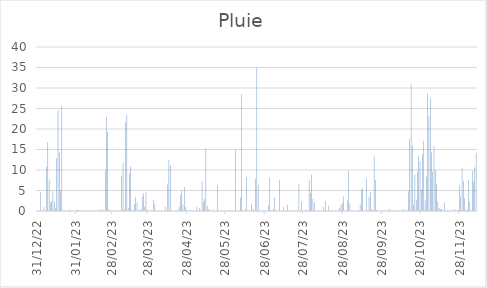
| Category | Pluie |
|---|---|
| 2022-12-31 | 0 |
| 2023-01-01 | 0 |
| 2023-01-02 | 4.57 |
| 2023-01-03 | 0 |
| 2023-01-04 | 0 |
| 2023-01-05 | 1.02 |
| 2023-01-06 | 0 |
| 2023-01-07 | 10.86 |
| 2023-01-08 | 16.76 |
| 2023-01-09 | 7.68 |
| 2023-01-10 | 2.16 |
| 2023-01-11 | 2.41 |
| 2023-01-12 | 4.89 |
| 2023-01-13 | 2.29 |
| 2023-01-14 | 0.64 |
| 2023-01-15 | 12.89 |
| 2023-01-16 | 24.57 |
| 2023-01-17 | 14.29 |
| 2023-01-18 | 5.08 |
| 2023-01-19 | 25.53 |
| 2023-01-20 | 0 |
| 2023-01-21 | 0 |
| 2023-01-22 | 0 |
| 2023-01-23 | 0 |
| 2023-01-24 | 0 |
| 2023-01-25 | 0.38 |
| 2023-01-26 | 0 |
| 2023-01-27 | 0 |
| 2023-01-28 | 0 |
| 2023-01-29 | 0 |
| 2023-01-30 | 0 |
| 2023-01-31 | 0.38 |
| 2023-02-01 | 0.25 |
| 2023-02-02 | 0 |
| 2023-02-03 | 0 |
| 2023-02-04 | 0 |
| 2023-02-05 | 0 |
| 2023-02-06 | 0 |
| 2023-02-07 | 0 |
| 2023-02-08 | 0 |
| 2023-02-09 | 0 |
| 2023-02-10 | 0 |
| 2023-02-11 | 0 |
| 2023-02-12 | 0 |
| 2023-02-13 | 0 |
| 2023-02-14 | 0 |
| 2023-02-15 | 0 |
| 2023-02-16 | 0 |
| 2023-02-17 | 0 |
| 2023-02-18 | 0.38 |
| 2023-02-19 | 0 |
| 2023-02-20 | 0.38 |
| 2023-02-21 | 0 |
| 2023-02-22 | 9.91 |
| 2023-02-23 | 22.99 |
| 2023-02-24 | 19.3 |
| 2023-02-25 | 0.38 |
| 2023-02-26 | 0 |
| 2023-02-27 | 0 |
| 2023-02-28 | 0 |
| 2023-03-01 | 0 |
| 2023-03-02 | 0 |
| 2023-03-03 | 0 |
| 2023-03-04 | 0 |
| 2023-03-05 | 0 |
| 2023-03-06 | 0 |
| 2023-03-07 | 8.64 |
| 2023-03-08 | 11.68 |
| 2023-03-09 | 0.51 |
| 2023-03-10 | 21.72 |
| 2023-03-11 | 23.43 |
| 2023-03-12 | 0.76 |
| 2023-03-13 | 9.21 |
| 2023-03-14 | 10.86 |
| 2023-03-15 | 0.25 |
| 2023-03-16 | 0 |
| 2023-03-17 | 1.71 |
| 2023-03-18 | 3.43 |
| 2023-03-19 | 2.1 |
| 2023-03-20 | 0 |
| 2023-03-21 | 0 |
| 2023-03-22 | 0.51 |
| 2023-03-23 | 3.49 |
| 2023-03-24 | 4.32 |
| 2023-03-25 | 1.02 |
| 2023-03-26 | 4.51 |
| 2023-03-27 | 0.38 |
| 2023-03-28 | 0 |
| 2023-03-29 | 0 |
| 2023-03-30 | 0 |
| 2023-03-31 | 0 |
| 2023-04-01 | 2.73 |
| 2023-04-02 | 1.65 |
| 2023-04-03 | 0 |
| 2023-04-04 | 0 |
| 2023-04-05 | 0 |
| 2023-04-06 | 0 |
| 2023-04-07 | 0 |
| 2023-04-08 | 0 |
| 2023-04-09 | 0 |
| 2023-04-10 | 1.02 |
| 2023-04-11 | 0 |
| 2023-04-12 | 6.48 |
| 2023-04-13 | 12.51 |
| 2023-04-14 | 11.24 |
| 2023-04-15 | 0 |
| 2023-04-16 | 0 |
| 2023-04-17 | 0 |
| 2023-04-18 | 0 |
| 2023-04-19 | 0 |
| 2023-04-20 | 0 |
| 2023-04-21 | 1.02 |
| 2023-04-22 | 3.94 |
| 2023-04-23 | 4.95 |
| 2023-04-24 | 1.52 |
| 2023-04-25 | 5.84 |
| 2023-04-26 | 1.02 |
| 2023-04-27 | 0.25 |
| 2023-04-28 | 0 |
| 2023-04-29 | 0 |
| 2023-04-30 | 0.25 |
| 2023-05-01 | 0 |
| 2023-05-02 | 0 |
| 2023-05-03 | 0 |
| 2023-05-04 | 0 |
| 2023-05-05 | 1.02 |
| 2023-05-06 | 0 |
| 2023-05-07 | 0.76 |
| 2023-05-08 | 0 |
| 2023-05-09 | 7.37 |
| 2023-05-10 | 2.29 |
| 2023-05-11 | 2.92 |
| 2023-05-12 | 15.3 |
| 2023-05-13 | 1.27 |
| 2023-05-14 | 0.51 |
| 2023-05-15 | 0 |
| 2023-05-16 | 0 |
| 2023-05-17 | 0 |
| 2023-05-18 | 0 |
| 2023-05-19 | 0 |
| 2023-05-20 | 0 |
| 2023-05-21 | 6.29 |
| 2023-05-22 | 0 |
| 2023-05-23 | 0 |
| 2023-05-24 | 0 |
| 2023-05-25 | 0 |
| 2023-05-26 | 0 |
| 2023-05-27 | 0 |
| 2023-05-28 | 0 |
| 2023-05-29 | 0 |
| 2023-05-30 | 0 |
| 2023-05-31 | 0 |
| 2023-06-01 | 0 |
| 2023-06-02 | 0 |
| 2023-06-03 | 0 |
| 2023-06-04 | 14.92 |
| 2023-06-05 | 0 |
| 2023-06-06 | 0 |
| 2023-06-07 | 0 |
| 2023-06-08 | 3.3 |
| 2023-06-09 | 28.45 |
| 2023-06-10 | 0 |
| 2023-06-11 | 0 |
| 2023-06-12 | 0.51 |
| 2023-06-13 | 8.26 |
| 2023-06-14 | 0 |
| 2023-06-15 | 0 |
| 2023-06-16 | 0 |
| 2023-06-17 | 1.78 |
| 2023-06-18 | 0.51 |
| 2023-06-19 | 0 |
| 2023-06-20 | 7.81 |
| 2023-06-21 | 34.86 |
| 2023-06-22 | 6.41 |
| 2023-06-23 | 0 |
| 2023-06-24 | 0 |
| 2023-06-25 | 0 |
| 2023-06-26 | 0 |
| 2023-06-27 | 0 |
| 2023-06-28 | 0 |
| 2023-06-29 | 0 |
| 2023-06-30 | 1.52 |
| 2023-07-01 | 8.13 |
| 2023-07-02 | 0.25 |
| 2023-07-03 | 0 |
| 2023-07-04 | 0.51 |
| 2023-07-05 | 3.37 |
| 2023-07-06 | 0 |
| 2023-07-07 | 0 |
| 2023-07-08 | 0 |
| 2023-07-09 | 7.62 |
| 2023-07-10 | 0 |
| 2023-07-11 | 0 |
| 2023-07-12 | 1.02 |
| 2023-07-13 | 0 |
| 2023-07-14 | 0 |
| 2023-07-15 | 1.52 |
| 2023-07-16 | 0 |
| 2023-07-17 | 0 |
| 2023-07-18 | 0 |
| 2023-07-19 | 0 |
| 2023-07-20 | 0 |
| 2023-07-21 | 0 |
| 2023-07-22 | 0 |
| 2023-07-23 | 0 |
| 2023-07-24 | 6.6 |
| 2023-07-25 | 0 |
| 2023-07-26 | 2.29 |
| 2023-07-27 | 0 |
| 2023-07-28 | 0 |
| 2023-07-29 | 0.25 |
| 2023-07-30 | 0 |
| 2023-07-31 | 0 |
| 2023-08-01 | 7.62 |
| 2023-08-02 | 4.32 |
| 2023-08-03 | 8.89 |
| 2023-08-04 | 2.98 |
| 2023-08-05 | 2.03 |
| 2023-08-06 | 0 |
| 2023-08-07 | 0 |
| 2023-08-08 | 0 |
| 2023-08-09 | 0 |
| 2023-08-10 | 0 |
| 2023-08-11 | 0 |
| 2023-08-12 | 1.02 |
| 2023-08-13 | 0 |
| 2023-08-14 | 2.41 |
| 2023-08-15 | 0 |
| 2023-08-16 | 1.27 |
| 2023-08-17 | 0 |
| 2023-08-18 | 0 |
| 2023-08-19 | 0 |
| 2023-08-20 | 0 |
| 2023-08-21 | 0 |
| 2023-08-22 | 0 |
| 2023-08-23 | 0 |
| 2023-08-24 | 0 |
| 2023-08-25 | 0.76 |
| 2023-08-26 | 1.52 |
| 2023-08-27 | 1.97 |
| 2023-08-28 | 3.56 |
| 2023-08-29 | 0 |
| 2023-08-30 | 0 |
| 2023-08-31 | 2.54 |
| 2023-09-01 | 9.84 |
| 2023-09-02 | 1.78 |
| 2023-09-03 | 0 |
| 2023-09-04 | 0 |
| 2023-09-05 | 0 |
| 2023-09-06 | 0 |
| 2023-09-07 | 0 |
| 2023-09-08 | 0 |
| 2023-09-09 | 0 |
| 2023-09-10 | 1.52 |
| 2023-09-11 | 5.27 |
| 2023-09-12 | 5.52 |
| 2023-09-13 | 0 |
| 2023-09-14 | 0 |
| 2023-09-15 | 7.94 |
| 2023-09-16 | 0 |
| 2023-09-17 | 3.49 |
| 2023-09-18 | 4.64 |
| 2023-09-19 | 0.51 |
| 2023-09-20 | 0 |
| 2023-09-21 | 13.27 |
| 2023-09-22 | 7.56 |
| 2023-09-23 | 0.38 |
| 2023-09-24 | 0 |
| 2023-09-25 | 0 |
| 2023-09-26 | 0 |
| 2023-09-27 | 0 |
| 2023-09-28 | 0 |
| 2023-09-29 | 0 |
| 2023-09-30 | 0 |
| 2023-10-01 | 0 |
| 2023-10-02 | 0 |
| 2023-10-03 | 0.51 |
| 2023-10-04 | 0 |
| 2023-10-05 | 0 |
| 2023-10-06 | 0 |
| 2023-10-07 | 0 |
| 2023-10-08 | 0 |
| 2023-10-09 | 0 |
| 2023-10-10 | 0 |
| 2023-10-11 | 0 |
| 2023-10-12 | 0 |
| 2023-10-13 | 0 |
| 2023-10-14 | 0.51 |
| 2023-10-15 | 0 |
| 2023-10-16 | 0 |
| 2023-10-17 | 0 |
| 2023-10-18 | 4.83 |
| 2023-10-19 | 17.53 |
| 2023-10-20 | 30.92 |
| 2023-10-21 | 16 |
| 2023-10-22 | 1.52 |
| 2023-10-23 | 8.89 |
| 2023-10-24 | 2.79 |
| 2023-10-25 | 9.65 |
| 2023-10-26 | 13.46 |
| 2023-10-27 | 12.13 |
| 2023-10-28 | 5.27 |
| 2023-10-29 | 13.84 |
| 2023-10-30 | 17.15 |
| 2023-10-31 | 2.54 |
| 2023-11-01 | 8.38 |
| 2023-11-02 | 28.64 |
| 2023-11-03 | 23.11 |
| 2023-11-04 | 27.56 |
| 2023-11-05 | 14.29 |
| 2023-11-06 | 9.65 |
| 2023-11-07 | 15.88 |
| 2023-11-08 | 9.91 |
| 2023-11-09 | 6.6 |
| 2023-11-10 | 2.29 |
| 2023-11-11 | 0.76 |
| 2023-11-12 | 0.51 |
| 2023-11-13 | 0.51 |
| 2023-11-14 | 0 |
| 2023-11-15 | 2.16 |
| 2023-11-16 | 0 |
| 2023-11-17 | 0 |
| 2023-11-18 | 0 |
| 2023-11-19 | 0 |
| 2023-11-20 | 0 |
| 2023-11-21 | 0 |
| 2023-11-22 | 0 |
| 2023-11-23 | 0.51 |
| 2023-11-24 | 0 |
| 2023-11-25 | 0 |
| 2023-11-26 | 0.25 |
| 2023-11-27 | 6.35 |
| 2023-11-28 | 3.56 |
| 2023-11-29 | 10.41 |
| 2023-11-30 | 7.37 |
| 2023-12-01 | 3.05 |
| 2023-12-02 | 0.25 |
| 2023-12-03 | 0.38 |
| 2023-12-04 | 7.56 |
| 2023-12-05 | 2.29 |
| 2023-12-06 | 0 |
| 2023-12-07 | 9.78 |
| 2023-12-08 | 7.11 |
| 2023-12-09 | 10.67 |
| 2023-12-10 | 14.22 |
| 2023-12-11 | 1.52 |